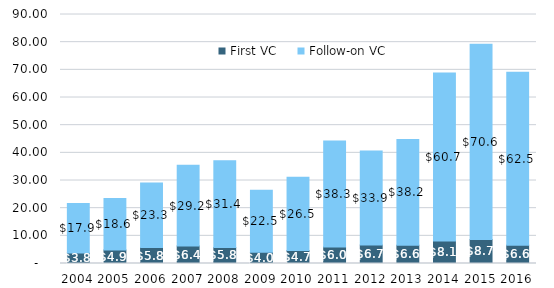
| Category | First VC | Follow-on VC |
|---|---|---|
| 2004.0 | 3.751 | 17.919 |
| 2005.0 | 4.886 | 18.64 |
| 2006.0 | 5.78 | 23.301 |
| 2007.0 | 6.363 | 29.187 |
| 2008.0 | 5.791 | 31.365 |
| 2009.0 | 4.023 | 22.452 |
| 2010.0 | 4.704 | 26.48 |
| 2011.0 | 5.965 | 38.331 |
| 2012.0 | 6.685 | 33.947 |
| 2013.0 | 6.618 | 38.2 |
| 2014.0 | 8.144 | 60.712 |
| 2015.0 | 8.693 | 70.566 |
| 2016.0 | 6.64 | 62.467 |